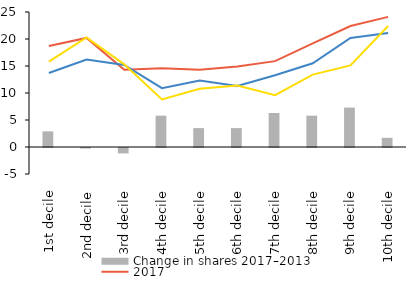
| Category | Change in shares 2017–2013  |
|---|---|
| 0 | 2.9 |
| 1 | -0.1 |
| 2 | -1 |
| 3 | 5.8 |
| 4 | 3.5 |
| 5 | 3.5 |
| 6 | 6.3 |
| 7 | 5.8 |
| 8 | 7.3 |
| 9 | 1.7 |